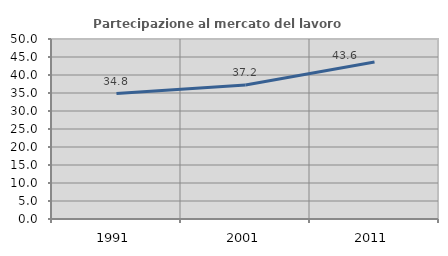
| Category | Partecipazione al mercato del lavoro  femminile |
|---|---|
| 1991.0 | 34.834 |
| 2001.0 | 37.216 |
| 2011.0 | 43.604 |